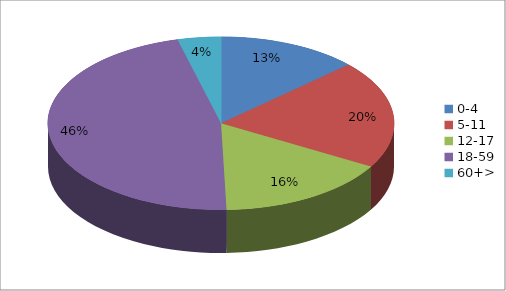
| Category | Series 0 |
|---|---|
| 0-4 | 0.13 |
| 5-11 | 0.2 |
| 12-17 | 0.16 |
| 18-59 | 0.46 |
| 60+> | 0.04 |